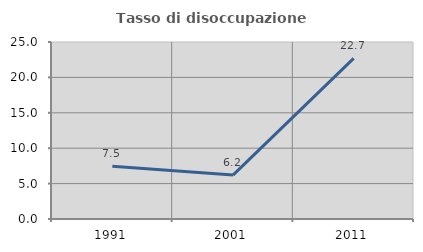
| Category | Tasso di disoccupazione giovanile  |
|---|---|
| 1991.0 | 7.453 |
| 2001.0 | 6.202 |
| 2011.0 | 22.689 |